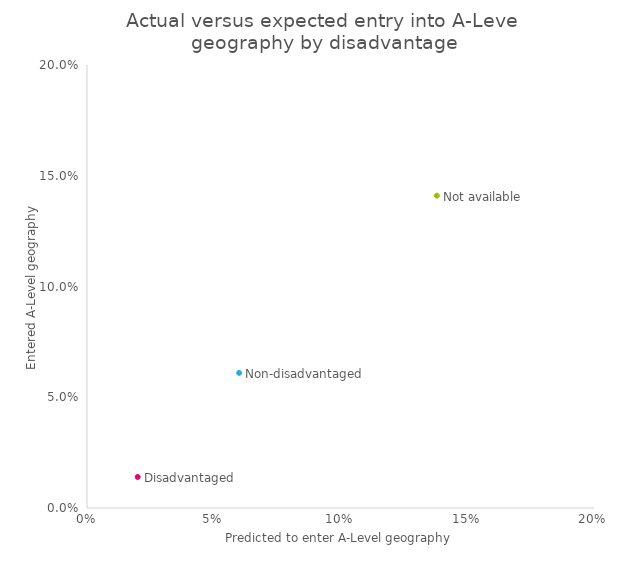
| Category | Series 0 |
|---|---|
| 0.02 | 0.014 |
| 0.06 | 0.061 |
| 0.138 | 0.141 |